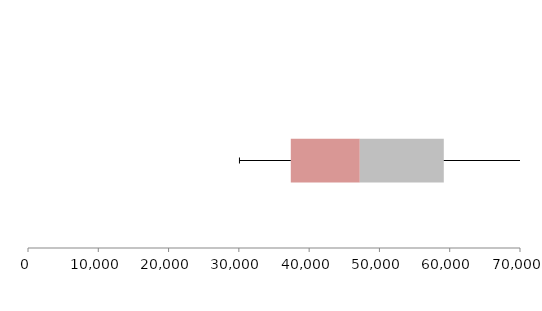
| Category | Series 1 | Series 2 | Series 3 |
|---|---|---|---|
| 0 | 37390.353 | 9816.147 | 11951.066 |